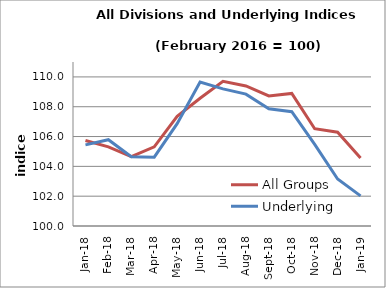
| Category | All Groups | Underlying |
|---|---|---|
| 2018-01-01 | 105.739 | 105.443 |
| 2018-02-01 | 105.308 | 105.79 |
| 2018-03-01 | 104.655 | 104.651 |
| 2018-04-01 | 105.309 | 104.614 |
| 2018-05-01 | 107.355 | 106.863 |
| 2018-06-01 | 108.567 | 109.659 |
| 2018-07-01 | 109.702 | 109.198 |
| 2018-08-01 | 109.392 | 108.845 |
| 2018-09-01 | 108.722 | 107.857 |
| 2018-10-01 | 108.895 | 107.664 |
| 2018-11-01 | 106.524 | 105.471 |
| 2018-12-01 | 106.292 | 103.148 |
| 2019-01-01 | 104.553 | 102.019 |